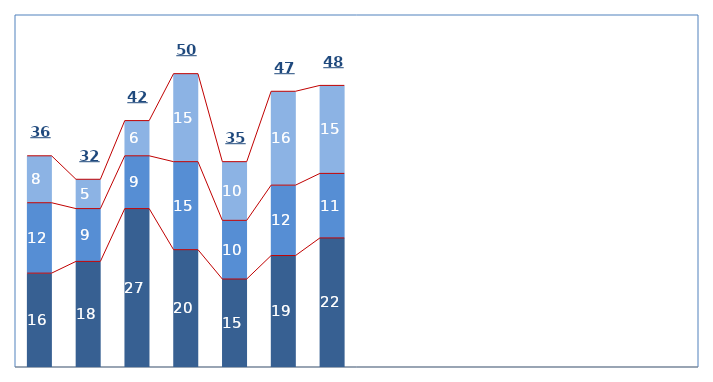
| Category | Series 0 | Series 1 | Series 2 |
|---|---|---|---|
| 0 | 16 | 12 | 8 |
| 1 | 18 | 9 | 5 |
| 2 | 27 | 9 | 6 |
| 3 | 20 | 15 | 15 |
| 4 | 15 | 10 | 10 |
| 5 | 19 | 12 | 16 |
| 6 | 22 | 11 | 15 |